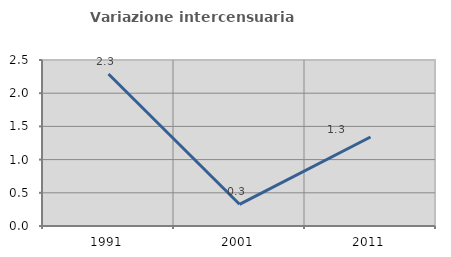
| Category | Variazione intercensuaria annua |
|---|---|
| 1991.0 | 2.288 |
| 2001.0 | 0.327 |
| 2011.0 | 1.341 |